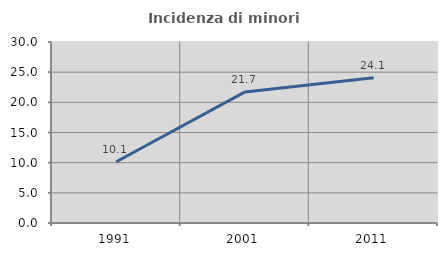
| Category | Incidenza di minori stranieri |
|---|---|
| 1991.0 | 10.145 |
| 2001.0 | 21.73 |
| 2011.0 | 24.055 |